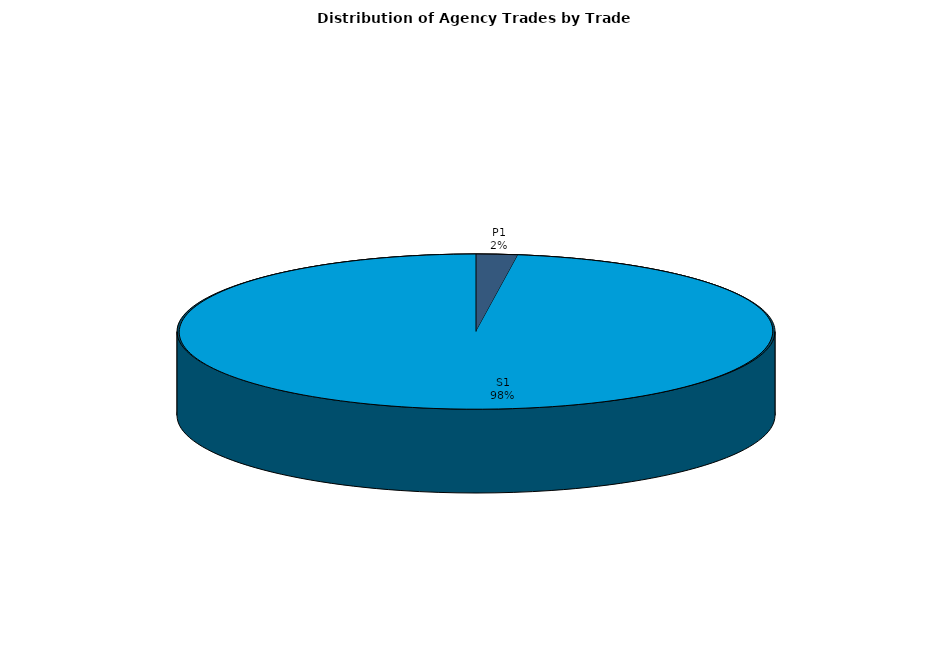
| Category | Series 0 |
|---|---|
| P1 | 72.271 |
| S1 | 3145.661 |